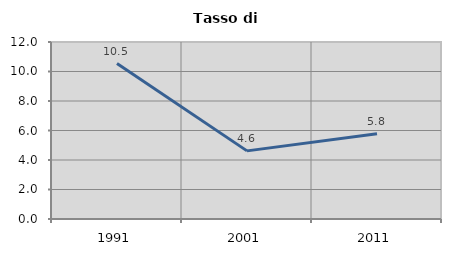
| Category | Tasso di disoccupazione   |
|---|---|
| 1991.0 | 10.537 |
| 2001.0 | 4.619 |
| 2011.0 | 5.785 |